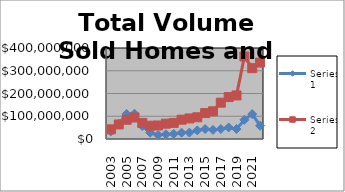
| Category | Series 0 | Series 1 |
|---|---|---|
| 2003.0 | 33514995 | 42428945 |
| 2004.0 | 67167717 | 63883804 |
| 2005.0 | 110039731 | 84678689 |
| 2006.0 | 111134904 | 94552113 |
| 2007.0 | 56636041 | 70702093 |
| 2008.0 | 27668783 | 58411380 |
| 2009.0 | 17663425 | 59418550 |
| 2010.0 | 20748550 | 67417547 |
| 2011.0 | 22154650 | 70736184 |
| 2012.0 | 27785150 | 84866351 |
| 2013.0 | 28275150 | 90321281 |
| 2014.0 | 37766200 | 95513372 |
| 2015.0 | 43767000 | 113898950 |
| 2016.0 | 40104401 | 121779613 |
| 2017.0 | 43941156 | 159806764 |
| 2018.0 | 50784525 | 184290560 |
| 2019.0 | 43955500 | 191475373 |
| 2020.0 | 84087274 | 362729061 |
| 2021.0 | 109489939 | 311363961 |
| 2022.0 | 58400473 | 336050243 |